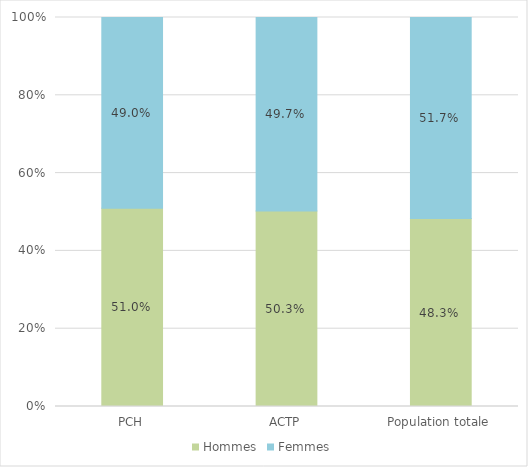
| Category | Hommes | Femmes |
|---|---|---|
| PCH | 0.51 | 0.49 |
| ACTP | 0.503 | 0.497 |
| Population totale | 0.483 | 0.517 |